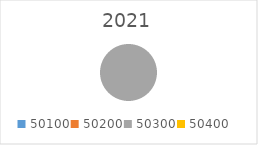
| Category | Series 0 |
|---|---|
| 50100.0 | 0 |
| 50200.0 | 0 |
| 50300.0 | 611801.42 |
| 50400.0 | 0 |